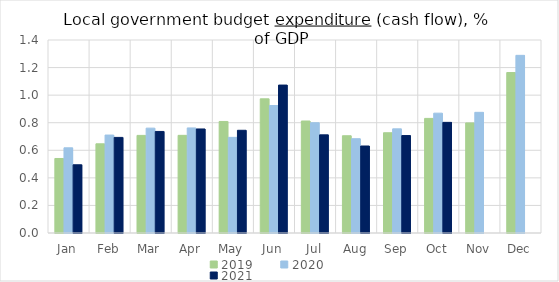
| Category | 2019 | 2020 | 2021 |
|---|---|---|---|
| Jan | 0.54 | 0.618 | 0.495 |
| Feb | 0.647 | 0.71 | 0.693 |
| Mar | 0.708 | 0.761 | 0.737 |
| Apr | 0.708 | 0.762 | 0.755 |
| May | 0.809 | 0.694 | 0.745 |
| Jun | 0.973 | 0.925 | 1.073 |
| Jul | 0.812 | 0.8 | 0.712 |
| Aug | 0.705 | 0.684 | 0.631 |
| Sep | 0.727 | 0.755 | 0.707 |
| Oct | 0.831 | 0.869 | 0.803 |
| Nov | 0.798 | 0.875 | 0 |
| Dec | 1.164 | 1.289 | 0 |